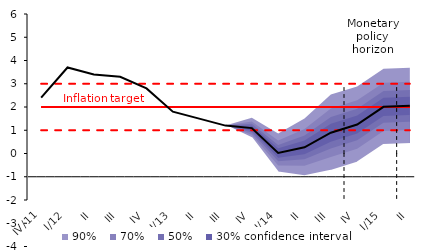
| Category | Inflation Target | Inflation Target - lower bound | Inflation Target - upper bound | Střed předpovědi |
|---|---|---|---|---|
| IV/11 | 2 | 1 | 3 | 2.4 |
| I/12 | 2 | 1 | 3 | 3.7 |
| II | 2 | 1 | 3 | 3.4 |
| III | 2 | 1 | 3 | 3.3 |
| IV | 2 | 1 | 3 | 2.8 |
| I/13 | 2 | 1 | 3 | 1.8 |
| II | 2 | 1 | 3 | 1.5 |
| III | 2 | 1 | 3 | 1.2 |
| IV | 2 | 1 | 3 | 1.092 |
| I/14 | 2 | 1 | 3 | 0.021 |
| II | 2 | 1 | 3 | 0.265 |
| III | 2 | 1 | 3 | 0.894 |
| IV | 2 | 1 | 3 | 1.245 |
| I/15 | 2 | 1 | 3 | 2.007 |
| II | 2 | 1 | 3 | 2.049 |